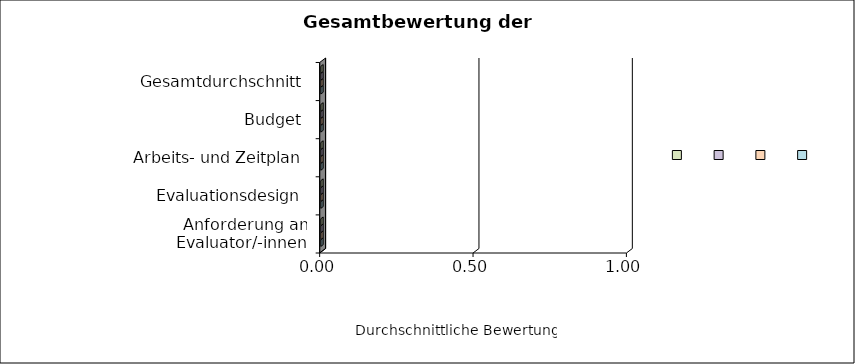
| Category | Series 3 | Series 2 | Series 1 | Series 0 |
|---|---|---|---|---|
| 0 | 0 | 0 | 0 | 0 |
| 1 | 0 | 0 | 0 | 0 |
| 2 | 0 | 0 | 0 | 0 |
| 3 | 0 | 0 | 0 | 0 |
| 4 | 0 | 0 | 0 | 0 |